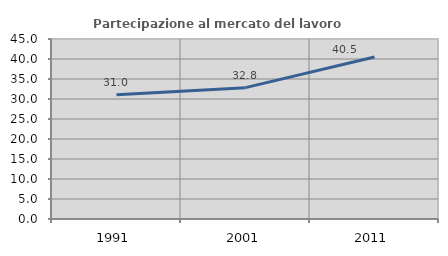
| Category | Partecipazione al mercato del lavoro  femminile |
|---|---|
| 1991.0 | 31.042 |
| 2001.0 | 32.836 |
| 2011.0 | 40.517 |